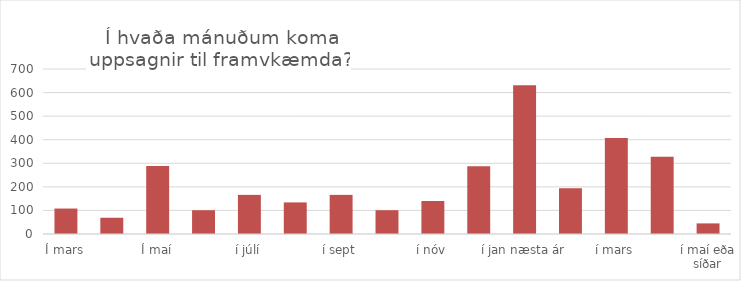
| Category | Series 0 |
|---|---|
| Í mars | 108 |
| Í apríl | 69 |
| Í maí | 289 |
| í júní | 101 |
| í júlí | 166 |
| í ágúst | 134 |
| í sept | 166 |
| í okt | 101 |
| í nóv | 140 |
| í des | 287 |
| í jan næsta ár | 631 |
| í feb | 194 |
| í mars | 407 |
| í apríl | 328 |
| í maí eða síðar | 45 |